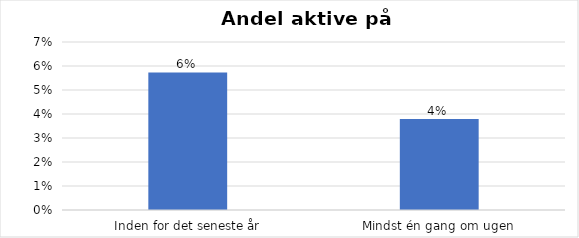
| Category | % |
|---|---|
| Inden for det seneste år | 0.057 |
| Mindst én gang om ugen | 0.038 |